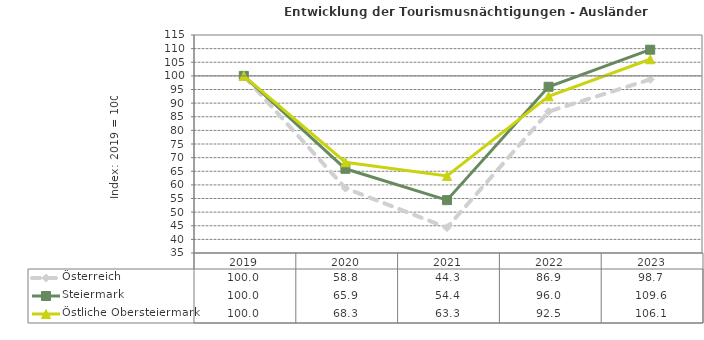
| Category | Österreich | Steiermark | Östliche Obersteiermark |
|---|---|---|---|
| 2023.0 | 98.7 | 109.6 | 106.1 |
| 2022.0 | 86.9 | 96 | 92.5 |
| 2021.0 | 44.3 | 54.4 | 63.3 |
| 2020.0 | 58.8 | 65.9 | 68.3 |
| 2019.0 | 100 | 100 | 100 |